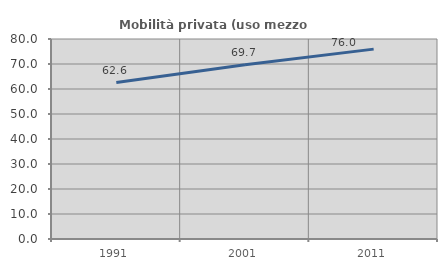
| Category | Mobilità privata (uso mezzo privato) |
|---|---|
| 1991.0 | 62.573 |
| 2001.0 | 69.744 |
| 2011.0 | 75.954 |